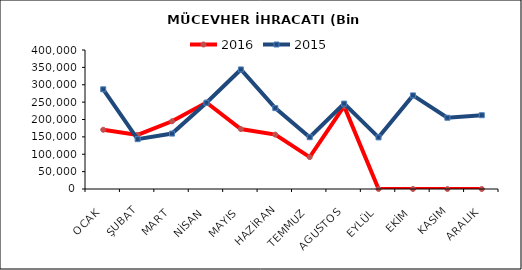
| Category | 2016 | 2015 |
|---|---|---|
| OCAK | 170447.061 | 286935.63 |
| ŞUBAT | 155566.387 | 143501.879 |
| MART | 194886.829 | 159471.979 |
| NİSAN | 248883.426 | 248153.54 |
| MAYIS | 172585.672 | 344006.662 |
| HAZİRAN | 156531.003 | 232756.336 |
| TEMMUZ | 91797.71 | 148979.15 |
| AGUSTOS | 238473.339 | 245689.597 |
| EYLÜL | 0 | 148522.465 |
| EKİM | 0 | 269340.007 |
| KASIM | 0 | 205010.069 |
| ARALIK | 0 | 212290.947 |